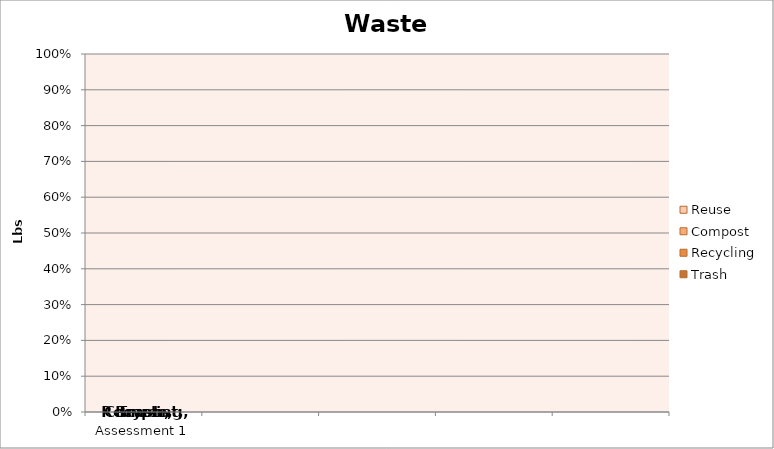
| Category | Trash | Recycling | Compost | Reuse |
|---|---|---|---|---|
| Assessment 1 | 0 | 0 | 0 | 0 |